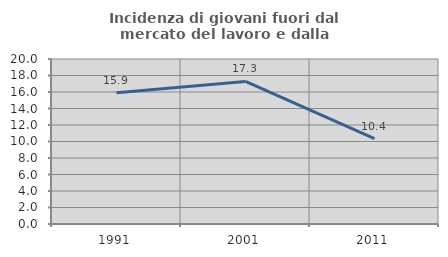
| Category | Incidenza di giovani fuori dal mercato del lavoro e dalla formazione  |
|---|---|
| 1991.0 | 15.906 |
| 2001.0 | 17.277 |
| 2011.0 | 10.356 |